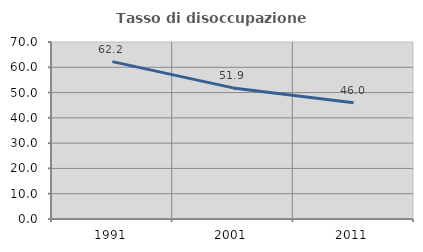
| Category | Tasso di disoccupazione giovanile  |
|---|---|
| 1991.0 | 62.241 |
| 2001.0 | 51.852 |
| 2011.0 | 46 |